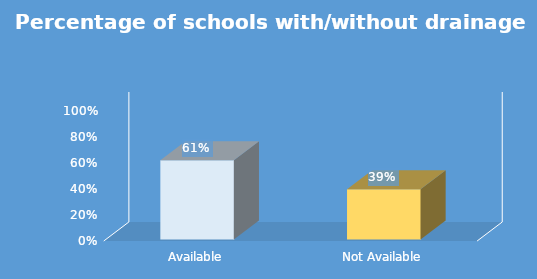
| Category | Series 0 |
|---|---|
| Available | 0.61 |
| Not Available | 0.387 |